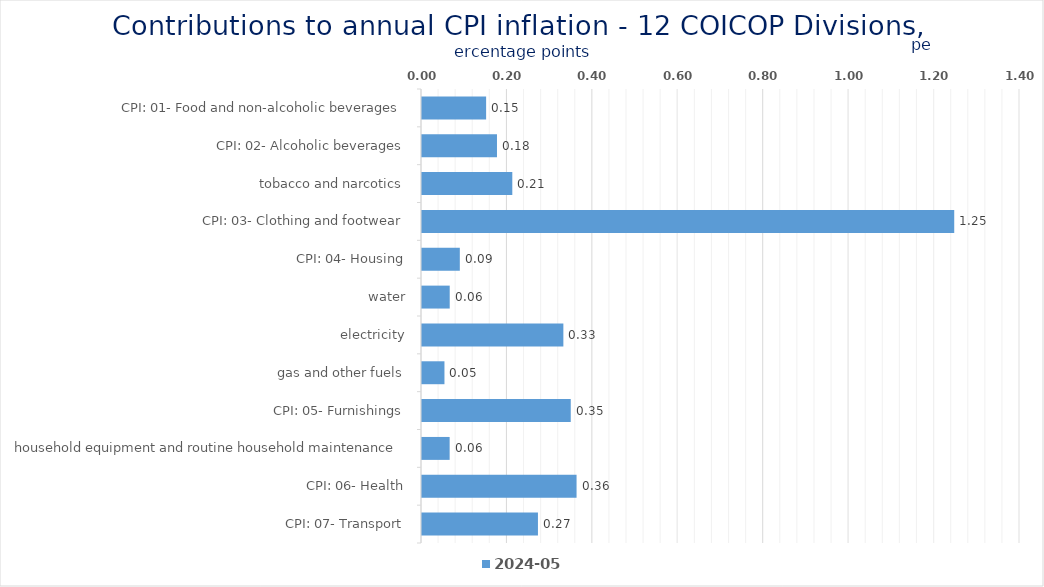
| Category | 2024-05 |
|---|---|
| CPI: 01- Food and non-alcoholic beverages | 0.15 |
| CPI: 02- Alcoholic beverages, tobacco and narcotics | 0.176 |
| CPI: 03- Clothing and footwear | 0.211 |
| CPI: 04- Housing, water, electricity, gas and other fuels | 1.246 |
| CPI: 05- Furnishings, household equipment and routine household maintenance | 0.089 |
| CPI: 06- Health | 0.065 |
| CPI: 07- Transport | 0.331 |
| CPI: 08- Communication | 0.053 |
| CPI: 09- Recreation and culture | 0.348 |
| CPI: 10- Education | 0.065 |
| CPI: 11- Restaurants and hotels | 0.362 |
| CPI: 12- Miscellaneous goods and services | 0.271 |